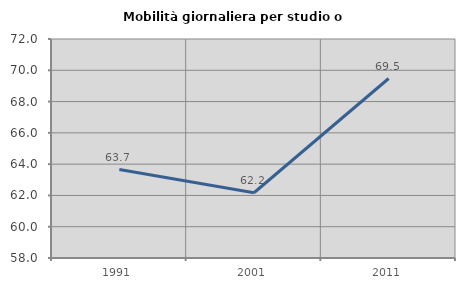
| Category | Mobilità giornaliera per studio o lavoro |
|---|---|
| 1991.0 | 63.655 |
| 2001.0 | 62.171 |
| 2011.0 | 69.474 |